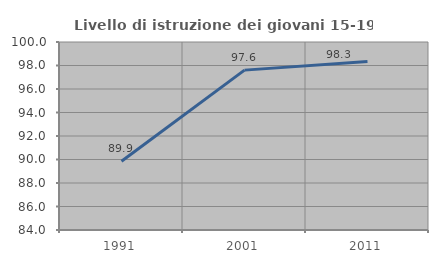
| Category | Livello di istruzione dei giovani 15-19 anni |
|---|---|
| 1991.0 | 89.855 |
| 2001.0 | 97.606 |
| 2011.0 | 98.35 |